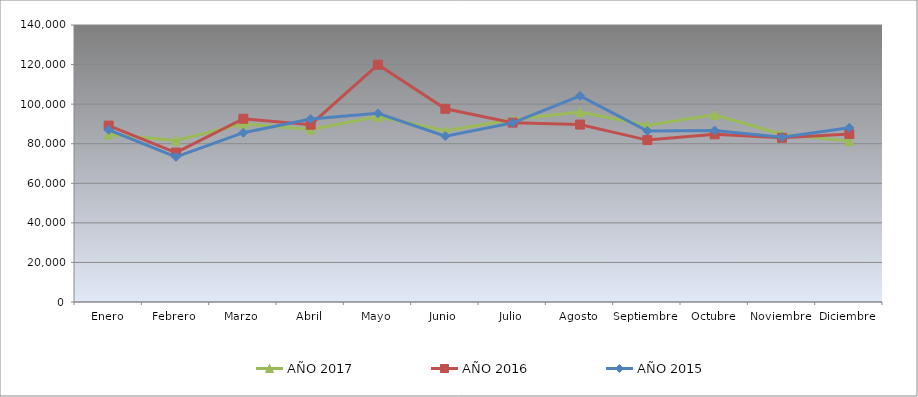
| Category | AÑO 2017 | AÑO 2016 | AÑO 2015 |
|---|---|---|---|
| Enero | 84645.462 | 89157.598 | 87020.979 |
| Febrero | 81615.701 | 75539.812 | 73389.258 |
| Marzo | 90062.553 | 92625.971 | 85563.346 |
| Abril | 87168.901 | 89598.285 | 92471.497 |
| Mayo | 93691.188 | 119956.753 | 95332.475 |
| Junio | 86578.193 | 97650.352 | 83842.416 |
| Julio | 92204.891 | 90656.479 | 90536.129 |
| Agosto | 95999.577 | 89674.453 | 104154.278 |
| Septiembre | 89284.017 | 81831.849 | 86442.812 |
| Octubre | 94570.445 | 84764.325 | 86673.536 |
| Noviembre | 84822.402 | 82982.533 | 83318.537 |
| Diciembre | 81305.375 | 84903.06 | 88095.882 |